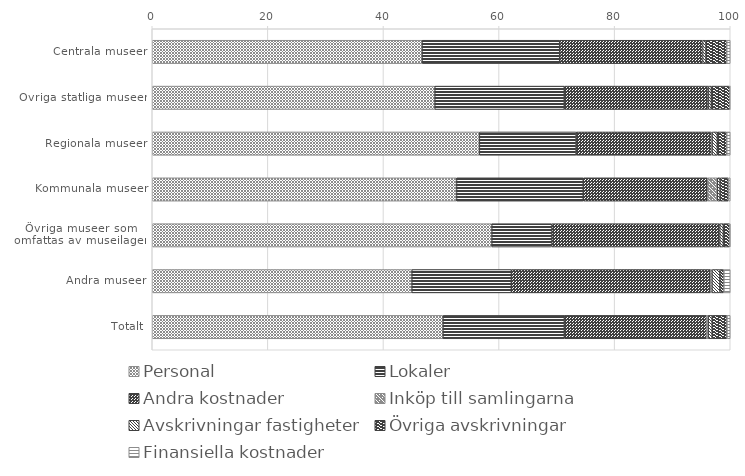
| Category | Personal | Lokaler | Andra kostnader | Inköp till samlingarna | Avskrivningar fastigheter | Övriga avskrivningar | Finansiella kostnader |
|---|---|---|---|---|---|---|---|
| Centrala museer | 46.67 | 23.828 | 24.716 | 0.012 | 0.581 | 3.584 | 0.61 |
| Övriga statliga museer | 48.881 | 22.411 | 24.898 | 0.028 | 0.517 | 3.189 | 0.077 |
| Regionala museer | 56.591 | 16.743 | 23.427 | 0.097 | 0.912 | 1.623 | 0.608 |
| Kommunala museer | 52.639 | 21.927 | 21.527 | 1.664 | 0.491 | 1.415 | 0.338 |
| Övriga museer som 
omfattas av museilagen | 58.738 | 10.368 | 29.073 | 0 | 0.63 | 1.083 | 0.108 |
| Andra museer | 44.905 | 17.23 | 34.461 | 0.242 | 1.367 | 0.694 | 1.102 |
| Totalt | 50.284 | 21.02 | 24.608 | 0.27 | 0.694 | 2.557 | 0.567 |